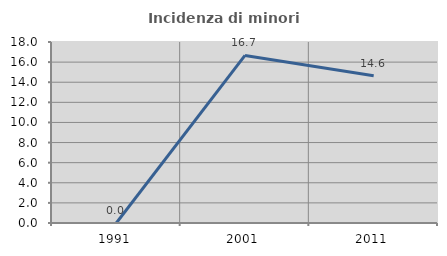
| Category | Incidenza di minori stranieri |
|---|---|
| 1991.0 | 0 |
| 2001.0 | 16.667 |
| 2011.0 | 14.634 |